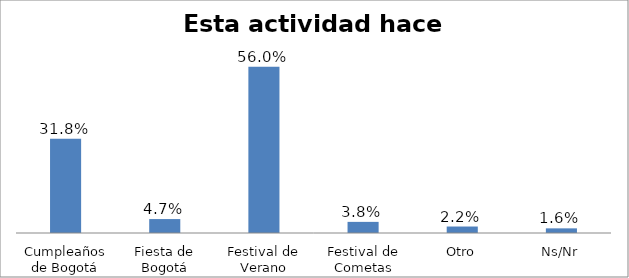
| Category | Series 0 |
|---|---|
| Cumpleaños de Bogotá | 0.318 |
| Fiesta de Bogotá | 0.047 |
| Festival de Verano | 0.56 |
| Festival de Cometas | 0.038 |
| Otro | 0.022 |
| Ns/Nr | 0.016 |